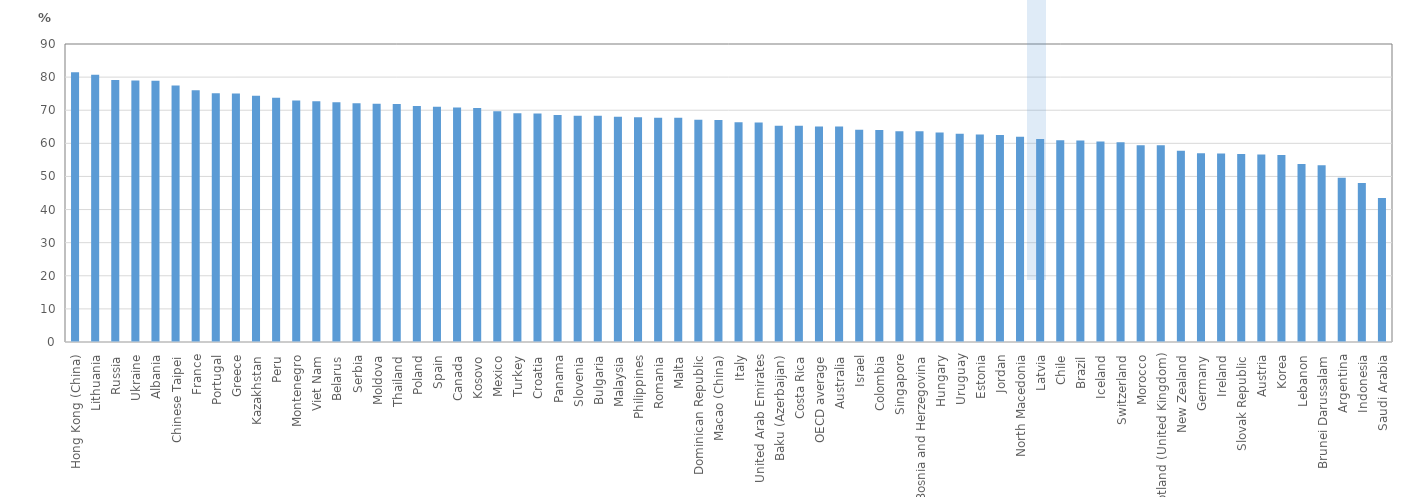
| Category | Percentage of students who are aware of public health issues |
|---|---|
| Hong Kong (China) | 81.433 |
| Lithuania | 80.705 |
| Russia | 79.121 |
| Ukraine | 78.958 |
| Albania | 78.887 |
| Chinese Taipei | 77.489 |
| France | 76.019 |
| Portugal | 75.135 |
| Greece | 75.084 |
| Kazakhstan | 74.375 |
| Peru | 73.801 |
| Montenegro | 72.918 |
| Viet Nam | 72.689 |
| Belarus | 72.407 |
| Serbia | 72.143 |
| Moldova | 71.944 |
| Thailand | 71.853 |
| Poland | 71.279 |
| Spain | 71.05 |
| Canada | 70.839 |
| Kosovo | 70.699 |
| Mexico | 69.695 |
| Turkey | 69.103 |
| Croatia | 68.999 |
| Panama | 68.538 |
| Slovenia | 68.317 |
| Bulgaria | 68.298 |
| Malaysia | 68.039 |
| Philippines | 67.876 |
| Romania | 67.701 |
| Malta | 67.69 |
| Dominican Republic | 67.129 |
| Macao (China) | 67.05 |
| Italy | 66.347 |
| United Arab Emirates | 66.268 |
| Baku (Azerbaijan) | 65.324 |
| Costa Rica | 65.29 |
| OECD average | 65.067 |
| Australia | 65.05 |
| Israel | 64.094 |
| Colombia | 64.029 |
| Singapore | 63.665 |
| Bosnia and Herzegovina | 63.629 |
| Hungary | 63.3 |
| Uruguay | 62.904 |
| Estonia | 62.654 |
| Jordan | 62.491 |
| North Macedonia | 61.955 |
| Latvia | 61.315 |
| Chile | 60.938 |
| Brazil | 60.865 |
| Iceland | 60.567 |
| Switzerland | 60.29 |
| Morocco | 59.457 |
| Scotland (United Kingdom) | 59.431 |
| New Zealand | 57.743 |
| Germany | 56.975 |
| Ireland | 56.948 |
| Slovak Republic | 56.792 |
| Austria | 56.602 |
| Korea | 56.505 |
| Lebanon | 53.749 |
| Brunei Darussalam | 53.375 |
| Argentina | 49.636 |
| Indonesia | 48.012 |
| Saudi Arabia | 43.467 |